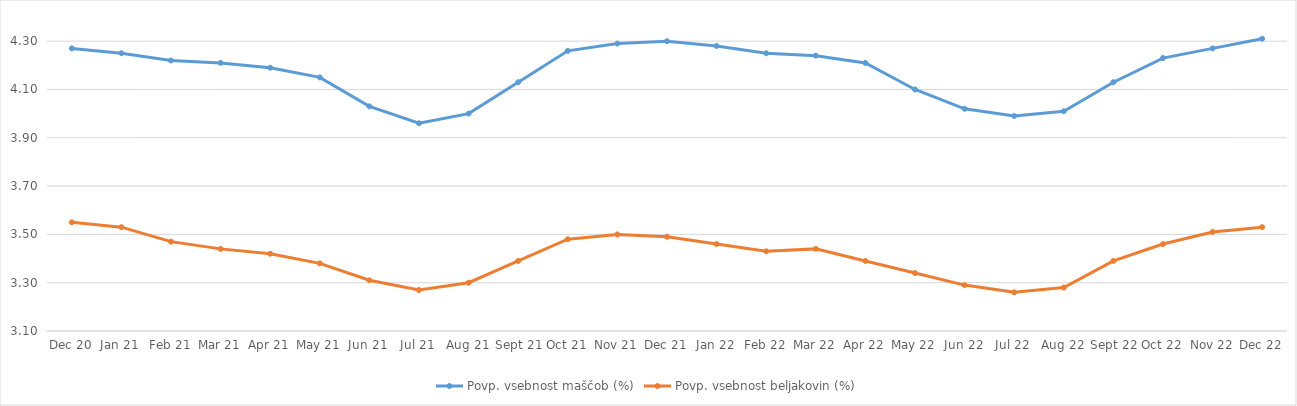
| Category | Povp. vsebnost maščob (%) | Povp. vsebnost beljakovin (%) |
|---|---|---|
| 2022-12-31 | 4.31 | 3.53 |
| 2022-11-30 | 4.27 | 3.51 |
| 2022-10-31 | 4.23 | 3.46 |
| 2022-09-01 | 4.13 | 3.39 |
| 2022-08-01 | 4.01 | 3.28 |
| 2022-07-01 | 3.99 | 3.26 |
| 2022-06-01 | 4.02 | 3.29 |
| 2022-05-01 | 4.1 | 3.34 |
| 2022-04-01 | 4.21 | 3.39 |
| 2022-03-01 | 4.24 | 3.44 |
| 2022-02-01 | 4.25 | 3.43 |
| 2022-01-01 | 4.28 | 3.46 |
| 2021-12-01 | 4.3 | 3.49 |
| 2021-11-01 | 4.29 | 3.5 |
| 2021-10-01 | 4.26 | 3.48 |
| 2021-09-01 | 4.13 | 3.39 |
| 2021-08-01 | 4 | 3.3 |
| 2021-07-01 | 3.96 | 3.27 |
| 2021-06-01 | 4.03 | 3.31 |
| 2021-05-01 | 4.15 | 3.38 |
| 2021-04-01 | 4.19 | 3.42 |
| 2021-03-01 | 4.21 | 3.44 |
| 2021-02-01 | 4.22 | 3.47 |
| 2021-01-01 | 4.25 | 3.53 |
| 2020-12-01 | 4.27 | 3.55 |